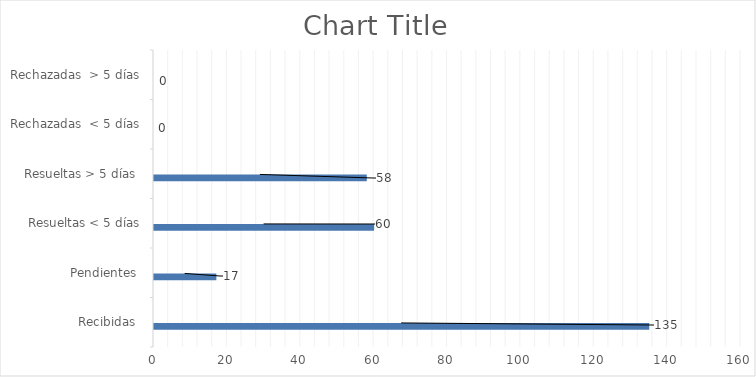
| Category | Física | PORTAL SAIP | 311 | Otras |
|---|---|---|---|---|
| Recibidas  | 0 | 135 | 0 | 0 |
| Pendientes  | 0 | 17 | 0 | 0 |
| Resueltas < 5 días | 0 | 60 | 0 | 0 |
| Resueltas > 5 días  | 0 | 58 | 0 | 0 |
| Rechazadas  < 5 días | 0 | 0 | 0 | 0 |
| Rechazadas  > 5 días | 0 | 0 | 0 | 0 |